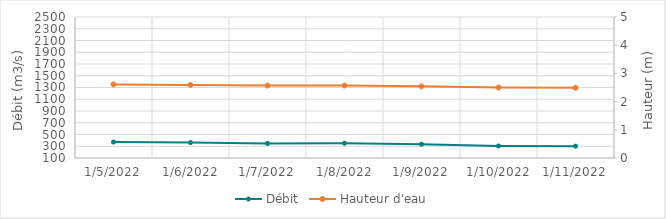
| Category | Débit |
|---|---|
| 8/1/21 | 569.56 |
| 7/31/21 | 637.71 |
| 7/30/21 | 647.09 |
| 7/29/21 | 620.51 |
| 7/28/21 | 537.93 |
| 7/27/21 | 546.07 |
| 7/26/21 | 553.46 |